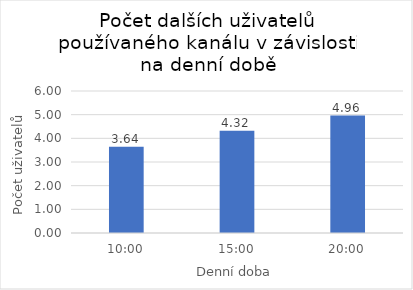
| Category | Počet dalších uživatelů používaného kanál |
|---|---|
| 0.4166666666666667 | 3.643 |
| 0.625 | 4.321 |
| 0.8333333333333334 | 4.964 |